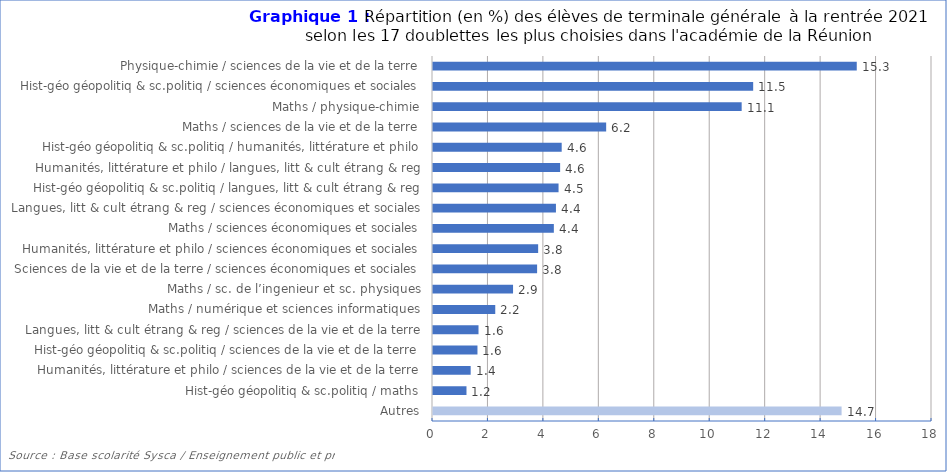
| Category | Series 1 |
|---|---|
| Autres | 14.739 |
| Hist-géo géopolitiq & sc.politiq / maths | 1.208 |
| Humanités, littérature et philo / sciences de la vie et de la terre | 1.359 |
| Hist-géo géopolitiq & sc.politiq / sciences de la vie et de la terre | 1.604 |
| Langues, litt & cult étrang & reg / sciences de la vie et de la terre | 1.642 |
| Maths / numérique et sciences informatiques | 2.246 |
| Maths / sc. de l’ingenieur et sc. physiques | 2.887 |
| Sciences de la vie et de la terre / sciences économiques et sociales | 3.755 |
| Humanités, littérature et philo / sciences économiques et sociales | 3.793 |
| Maths / sciences économiques et sociales | 4.359 |
| Langues, litt & cult étrang & reg / sciences économiques et sociales | 4.435 |
| Hist-géo géopolitiq & sc.politiq / langues, litt & cult étrang & reg | 4.529 |
| Humanités, littérature et philo / langues, litt & cult étrang & reg | 4.586 |
| Hist-géo géopolitiq & sc.politiq / humanités, littérature et philo | 4.642 |
| Maths / sciences de la vie et de la terre | 6.246 |
| Maths / physique-chimie | 11.134 |
| Hist-géo géopolitiq & sc.politiq / sciences économiques et sociales | 11.549 |
| Physique-chimie / sciences de la vie et de la terre | 15.286 |